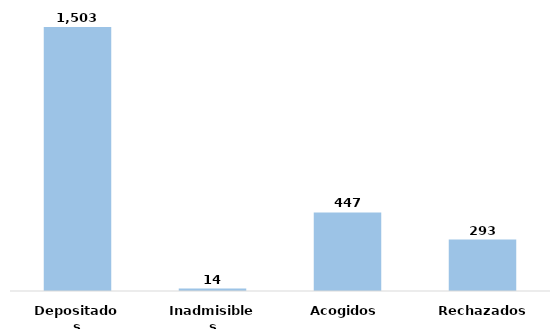
| Category | Series 0 |
|---|---|
| Depositados | 1503 |
| Inadmisibles | 14 |
| Acogidos | 447 |
| Rechazados | 293 |